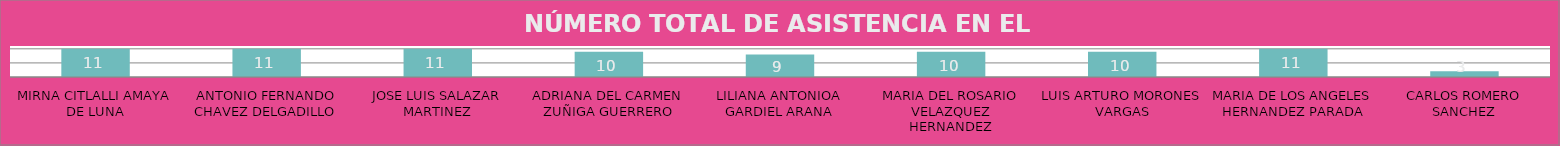
| Category | MIRNA CITLALLI AMAYA DE LUNA |
|---|---|
| MIRNA CITLALLI AMAYA DE LUNA | 11 |
| ANTONIO FERNANDO CHAVEZ DELGADILLO | 11 |
| JOSE LUIS SALAZAR MARTINEZ | 11 |
| ADRIANA DEL CARMEN ZUÑIGA GUERRERO | 10 |
| LILIANA ANTONIOA GARDIEL ARANA | 9 |
| MARIA DEL ROSARIO VELAZQUEZ HERNANDEZ | 10 |
| LUIS ARTURO MORONES VARGAS | 10 |
| MARIA DE LOS ANGELES HERNANDEZ PARADA | 11 |
| CARLOS ROMERO SANCHEZ | 3 |